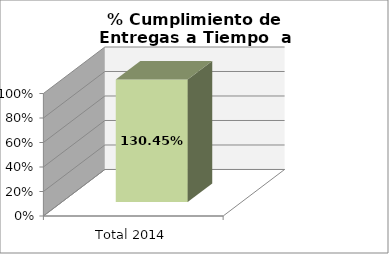
| Category | % |
|---|---|
| Total 2014 | 1.304 |